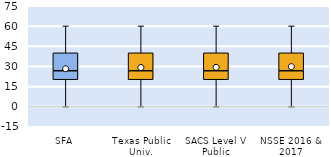
| Category | 25th | 50th | 75th |
|---|---|---|---|
| SFA | 20 | 6.667 | 13.333 |
| Texas Public Univ. | 20 | 6.667 | 13.333 |
| SACS Level V Public | 20 | 6.667 | 13.333 |
| NSSE 2016 & 2017 | 20 | 6.667 | 13.333 |